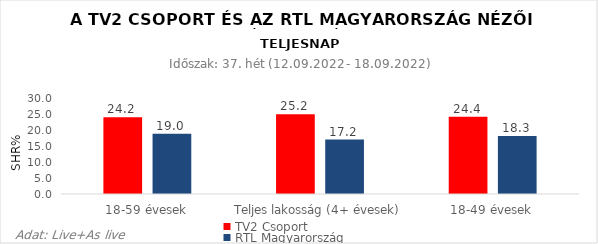
| Category | TV2 Csoport | RTL Magyarország |
|---|---|---|
| 18-59 évesek | 24.2 | 19 |
| Teljes lakosság (4+ évesek) | 25.2 | 17.2 |
| 18-49 évesek | 24.4 | 18.3 |